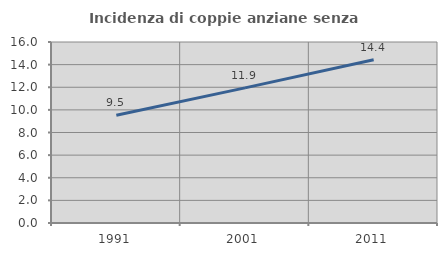
| Category | Incidenza di coppie anziane senza figli  |
|---|---|
| 1991.0 | 9.524 |
| 2001.0 | 11.942 |
| 2011.0 | 14.433 |